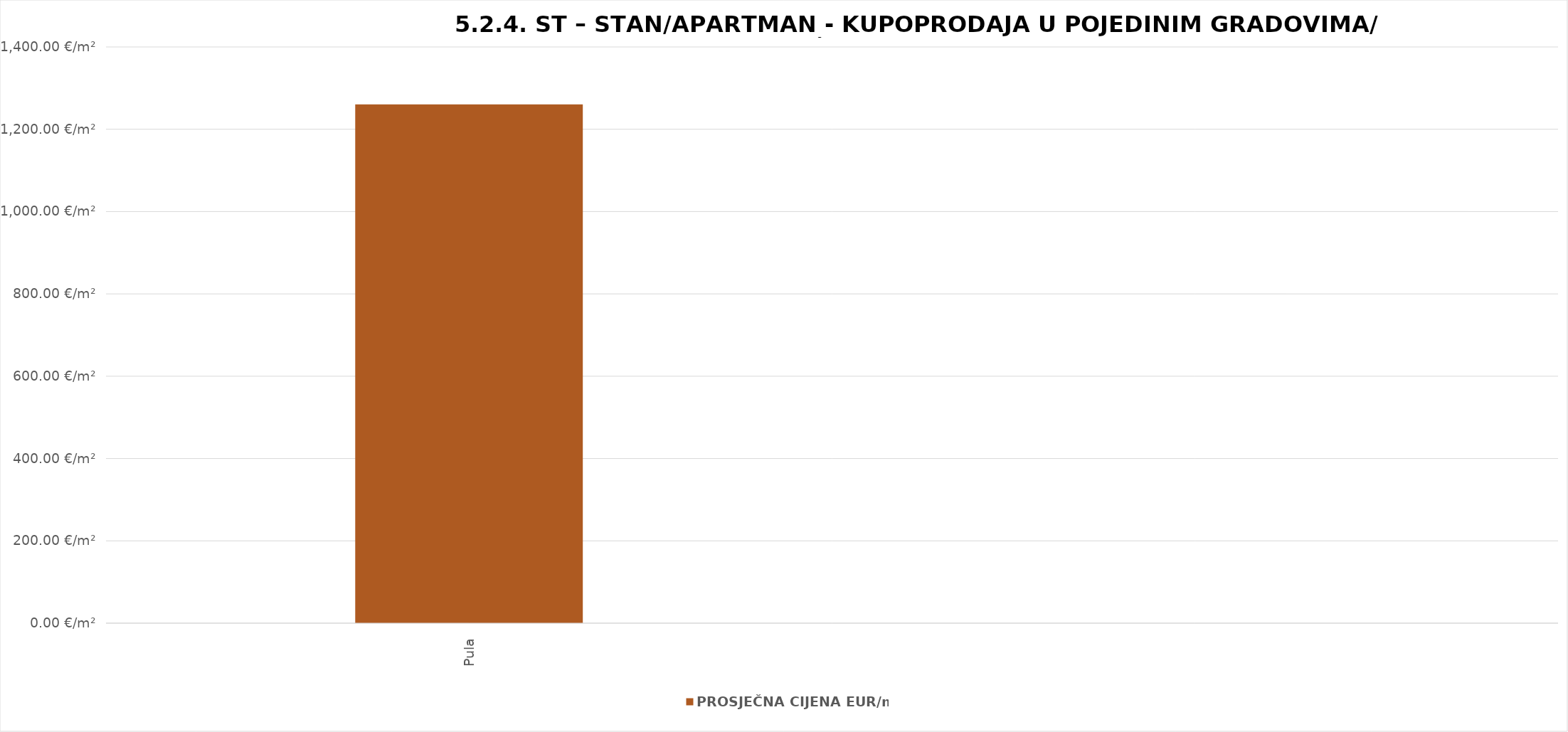
| Category | PROSJEČNA CIJENA EUR/m² |
|---|---|
| Pula | 1903-06-13 12:52:36 |